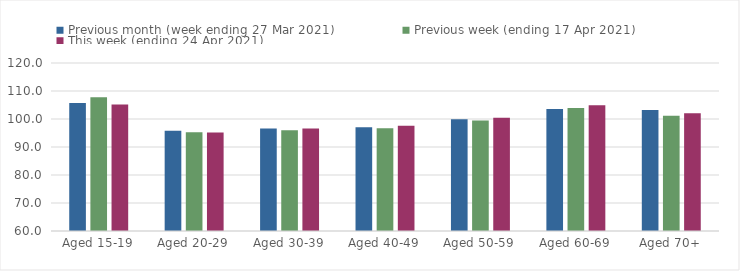
| Category | Previous month (week ending 27 Mar 2021) | Previous week (ending 17 Apr 2021) | This week (ending 24 Apr 2021) |
|---|---|---|---|
| Aged 15-19 | 105.7 | 107.74 | 105.22 |
| Aged 20-29 | 95.77 | 95.3 | 95.22 |
| Aged 30-39 | 96.57 | 95.99 | 96.64 |
| Aged 40-49 | 97.09 | 96.69 | 97.58 |
| Aged 50-59 | 99.93 | 99.48 | 100.48 |
| Aged 60-69 | 103.59 | 103.93 | 104.91 |
| Aged 70+ | 103.2 | 101.2 | 102.09 |